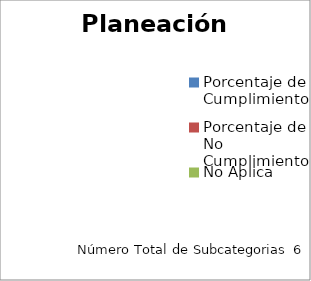
| Category | Planeación |
|---|---|
| Porcentaje de Cumplimiento | 0 |
| Porcentaje de No Cumplimiento | 0 |
| No Aplica | 0 |